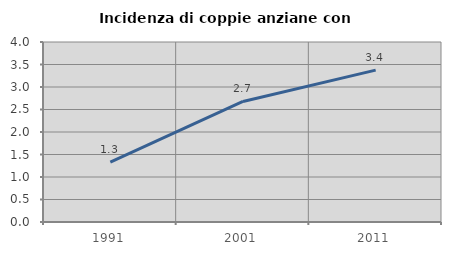
| Category | Incidenza di coppie anziane con figli |
|---|---|
| 1991.0 | 1.332 |
| 2001.0 | 2.68 |
| 2011.0 | 3.375 |